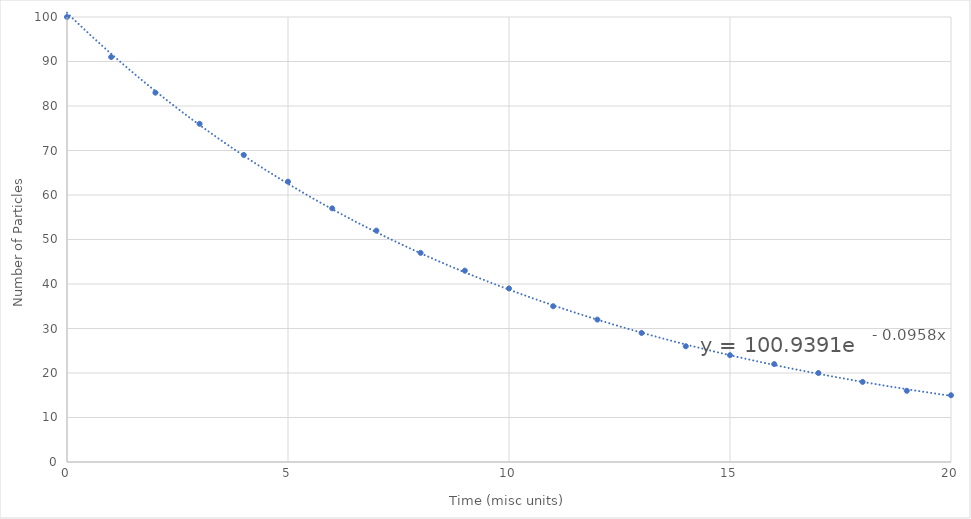
| Category | N |
|---|---|
| 0.0 | 100 |
| 1.0 | 91 |
| 2.0 | 83 |
| 3.0 | 76 |
| 4.0 | 69 |
| 5.0 | 63 |
| 6.0 | 57 |
| 7.0 | 52 |
| 8.0 | 47 |
| 9.0 | 43 |
| 10.0 | 39 |
| 11.0 | 35 |
| 12.0 | 32 |
| 13.0 | 29 |
| 14.0 | 26 |
| 15.0 | 24 |
| 16.0 | 22 |
| 17.0 | 20 |
| 18.0 | 18 |
| 19.0 | 16 |
| 20.0 | 15 |